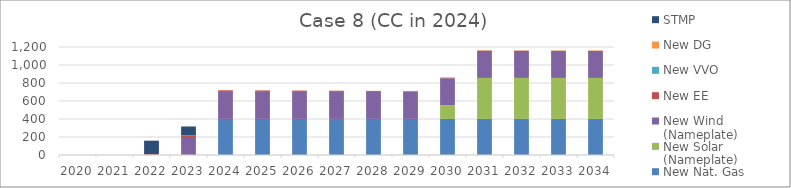
| Category | New Nat. Gas | New Solar (Nameplate) | New Wind (Nameplate) | New EE | New VVO | New DG | STMP |
|---|---|---|---|---|---|---|---|
| 2020.0 | 0 | 0 | 0 | 0 | 0 | 0 | 0 |
| 2021.0 | 0 | 0 | 0 | 0 | 0 | 0 | 0 |
| 2022.0 | 0 | 0 | 0 | 9.136 | 0 | 0 | 150 |
| 2023.0 | 0 | 0 | 200 | 15.91 | 0 | 1.022 | 100 |
| 2024.0 | 401 | 0 | 300 | 18.583 | 0 | 1.533 | 0 |
| 2025.0 | 401 | 0 | 300 | 16.623 | 0 | 1.533 | 0 |
| 2026.0 | 401 | 0 | 300 | 14.54 | 0 | 1.533 | 0 |
| 2027.0 | 401 | 0 | 300 | 12.425 | 0 | 2.044 | 0 |
| 2028.0 | 401 | 0 | 300 | 10.318 | 0 | 2.044 | 0 |
| 2029.0 | 401 | 0 | 300 | 8.163 | 0 | 2.555 | 0 |
| 2030.0 | 401 | 151.796 | 300 | 6.23 | 0 | 3.066 | 0 |
| 2031.0 | 401 | 455.389 | 300 | 4.541 | 0 | 3.577 | 0 |
| 2032.0 | 401 | 455.389 | 300 | 3.059 | 0 | 3.577 | 0 |
| 2033.0 | 401 | 455.389 | 300 | 1.941 | 0 | 4.088 | 0 |
| 2034.0 | 401 | 455.389 | 300 | 1.071 | 0 | 4.599 | 0 |